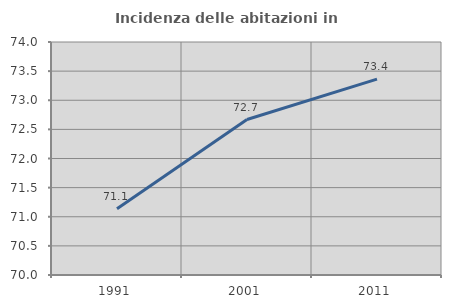
| Category | Incidenza delle abitazioni in proprietà  |
|---|---|
| 1991.0 | 71.138 |
| 2001.0 | 72.669 |
| 2011.0 | 73.362 |